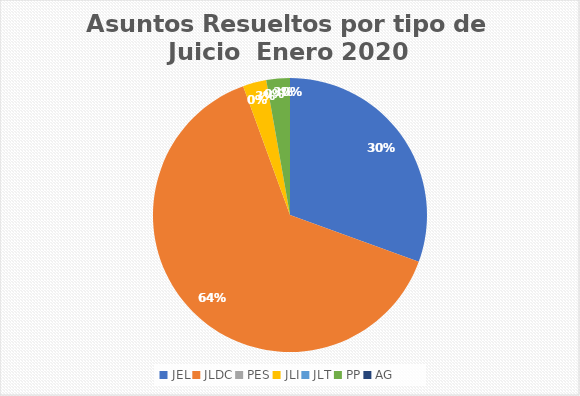
| Category | Asuntos Resueltos por tipo de Juicio  Enero |
|---|---|
| JEL | 11 |
| JLDC | 23 |
| PES | 0 |
| JLI | 1 |
| JLT | 0 |
| PP | 1 |
| AG | 0 |